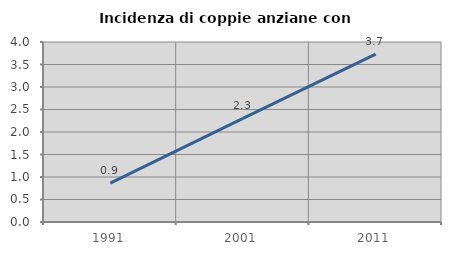
| Category | Incidenza di coppie anziane con figli |
|---|---|
| 1991.0 | 0.863 |
| 2001.0 | 2.304 |
| 2011.0 | 3.73 |